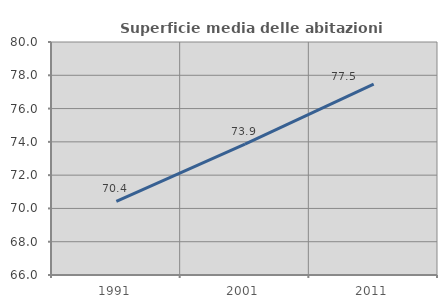
| Category | Superficie media delle abitazioni occupate |
|---|---|
| 1991.0 | 70.429 |
| 2001.0 | 73.86 |
| 2011.0 | 77.469 |